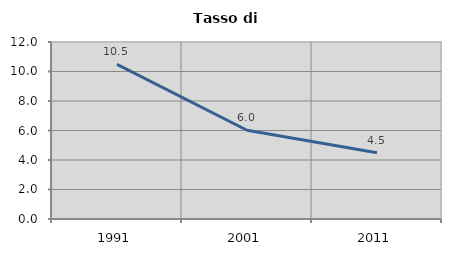
| Category | Tasso di disoccupazione   |
|---|---|
| 1991.0 | 10.487 |
| 2001.0 | 6.017 |
| 2011.0 | 4.489 |